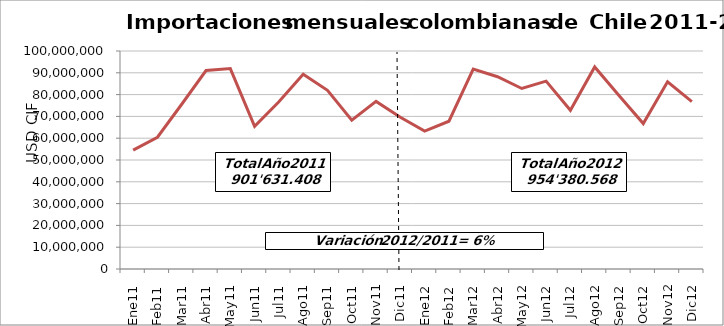
| Category | Series 0 |
|---|---|
| 0 | 54543516.48 |
| 1 | 60434540.52 |
| 2 | 75575474.95 |
| 3 | 91032103.69 |
| 4 | 91916905.92 |
| 5 | 65439995.91 |
| 6 | 76693171.52 |
| 7 | 89340544.7 |
| 8 | 81979703.5 |
| 9 | 68230200.39 |
| 10 | 76866813.98 |
| 11 | 69578436.23 |
| 12 | 63268332.79 |
| 13 | 67792096.37 |
| 14 | 91666677.99 |
| 15 | 88178718.66 |
| 16 | 82791634.05 |
| 17 | 86179542.26 |
| 18 | 72807740.77 |
| 19 | 92697033.5 |
| 20 | 79617212.37 |
| 21 | 66708236.62 |
| 22 | 85883400.93 |
| 23 | 76789941.25 |